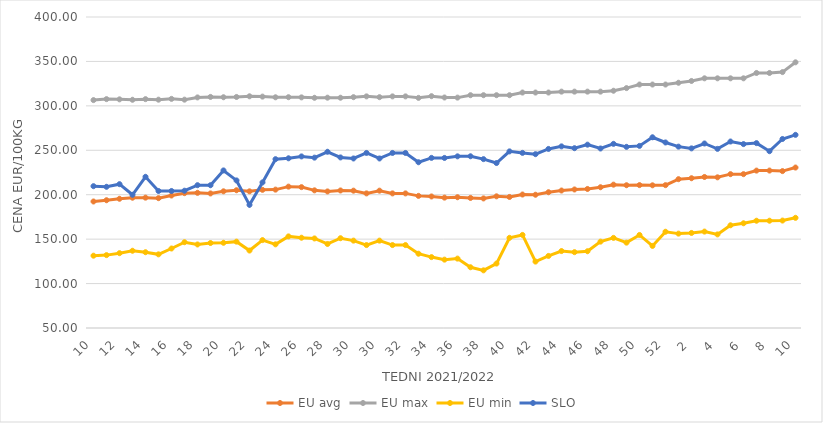
| Category | EU avg | EU max | EU min | SLO |
|---|---|---|---|---|
| 10.0 | 192.373 | 306.48 | 131.374 | 209.61 |
| 11.0 | 193.79 | 307.58 | 132.024 | 208.91 |
| 12.0 | 195.449 | 307.33 | 134.212 | 211.87 |
| 13.0 | 196.631 | 306.85 | 136.936 | 199.93 |
| 14.0 | 196.702 | 307.56 | 135.297 | 220.15 |
| 15.0 | 196.13 | 306.96 | 132.893 | 204.2 |
| 16.0 | 199.1 | 307.87 | 139.462 | 204.2 |
| 17.0 | 201.754 | 306.98 | 146.538 | 204.51 |
| 18.0 | 202.13 | 309.49 | 144.017 | 210.72 |
| 19.0 | 201.439 | 310.06 | 145.644 | 210.68 |
| 20.0 | 203.834 | 309.69 | 145.911 | 227.32 |
| 21.0 | 205.04 | 309.99 | 147.188 | 216.08 |
| 22.0 | 203.79 | 310.76 | 137.177 | 188.6 |
| 23.0 | 205.51 | 310.41 | 148.928 | 213.84 |
| 24.0 | 205.73 | 309.64 | 144.161 | 239.99 |
| 25.0 | 209.095 | 309.74 | 153.081 | 240.99 |
| 26.0 | 208.551 | 309.55 | 151.599 | 243.11 |
| 27.0 | 204.914 | 309.08 | 150.789 | 241.72 |
| 28.0 | 203.681 | 309.21 | 144.56 | 248.33 |
| 29.0 | 204.773 | 309.15 | 151.052 | 241.96 |
| 30.0 | 204.558 | 309.78 | 148.33 | 240.79 |
| 31.0 | 201.483 | 310.67 | 143.33 | 247 |
| 30.0 | 204.558 | 309.78 | 148.33 | 240.79 |
| 31.0 | 201.483 | 310.67 | 143.33 | 247 |
| 32.0 | 201.483 | 310.67 | 143.33 | 247 |
| 33.0 | 198.691 | 309 | 133.607 | 236.54 |
| 34.0 | 198.027 | 310.9 | 129.797 | 241.45 |
| 35.0 | 196.72 | 309.41 | 126.926 | 241.39 |
| 36.0 | 197.157 | 309.28 | 128.099 | 243.19 |
| 37.0 | 196.375 | 312 | 118.364 | 243.28 |
| 38.0 | 195.821 | 312 | 114.892 | 240.06 |
| 39.0 | 198.179 | 312 | 122.517 | 235.66 |
| 40.0 | 197.482 | 312 | 151.488 | 248.77 |
| 41.0 | 200.22 | 315 | 154.74 | 247.07 |
| 42.0 | 199.965 | 315 | 124.748 | 245.64 |
| 43.0 | 202.804 | 315 | 131.104 | 251.53 |
| 44.0 | 204.713 | 316 | 136.6 | 254.42 |
| 45.0 | 205.906 | 316 | 135.362 | 252.35 |
| 46.0 | 206.476 | 316 | 136.39 | 256.33 |
| 47.0 | 208.415 | 316 | 147.192 | 252.01 |
| 48.0 | 211.314 | 317 | 151.41 | 257.25 |
| 49.0 | 210.677 | 320 | 146.064 | 253.87 |
| 50.0 | 210.823 | 324 | 154.698 | 254.94 |
| 51.0 | 210.59 | 324 | 142.382 | 264.65 |
| 52.0 | 210.763 | 324 | 158.333 | 258.8 |
| 1.0 | 217.49 | 326 | 156.222 | 254.09 |
| 2.0 | 218.55 | 328 | 156.969 | 252.15 |
| 3.0 | 219.967 | 331 | 158.511 | 257.65 |
| 4.0 | 219.57 | 331 | 155.346 | 251.6 |
| 5.0 | 223.136 | 331 | 165.59 | 259.87 |
| 6.0 | 223.143 | 331 | 167.86 | 256.97 |
| 7.0 | 227.138 | 337 | 170.719 | 258.07 |
| 8.0 | 227.191 | 337 | 170.743 | 248.97 |
| 9.0 | 226.578 | 338 | 170.92 | 262.72 |
| 10.0 | 230.586 | 349 | 174 | 267.38 |